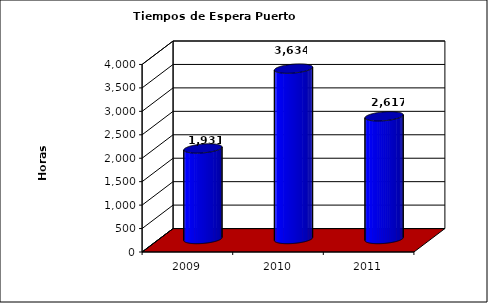
| Category | Series 0 |
|---|---|
| 2009.0 | 1930.86 |
| 2010.0 | 3634 |
| 2011.0 | 2616.6 |